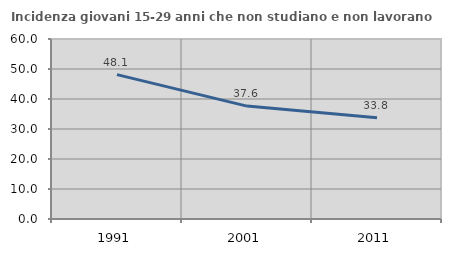
| Category | Incidenza giovani 15-29 anni che non studiano e non lavorano  |
|---|---|
| 1991.0 | 48.113 |
| 2001.0 | 37.634 |
| 2011.0 | 33.766 |